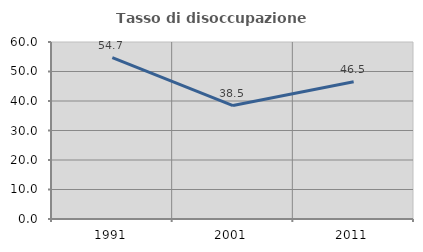
| Category | Tasso di disoccupazione giovanile  |
|---|---|
| 1991.0 | 54.717 |
| 2001.0 | 38.462 |
| 2011.0 | 46.512 |